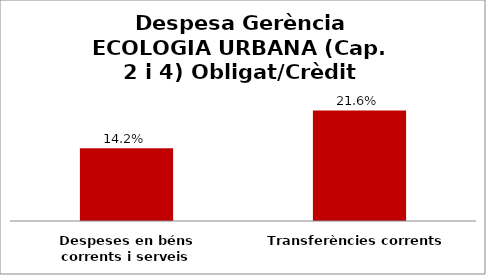
| Category | Series 0 |
|---|---|
| Despeses en béns corrents i serveis | 0.142 |
| Transferències corrents | 0.216 |